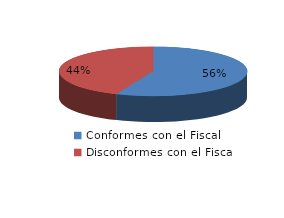
| Category | Series 0 |
|---|---|
| 0 | 783 |
| 1 | 607 |